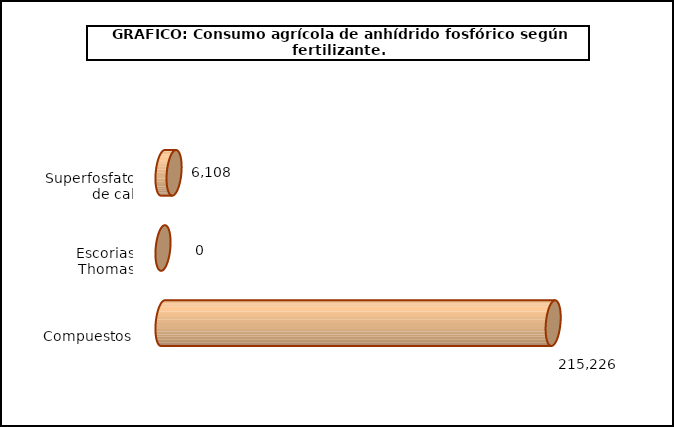
| Category | fert. N |
|---|---|
| 0 | 6108.201 |
| 1 | 0 |
| 2 | 215225.596 |